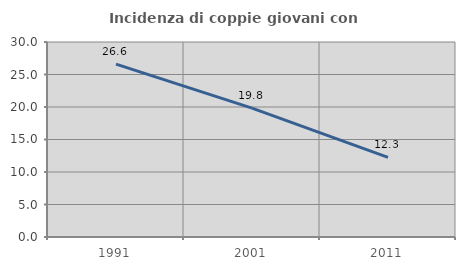
| Category | Incidenza di coppie giovani con figli |
|---|---|
| 1991.0 | 26.607 |
| 2001.0 | 19.831 |
| 2011.0 | 12.261 |